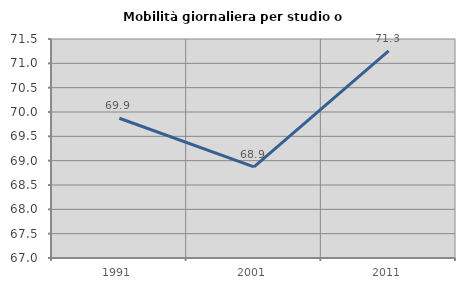
| Category | Mobilità giornaliera per studio o lavoro |
|---|---|
| 1991.0 | 69.872 |
| 2001.0 | 68.873 |
| 2011.0 | 71.254 |